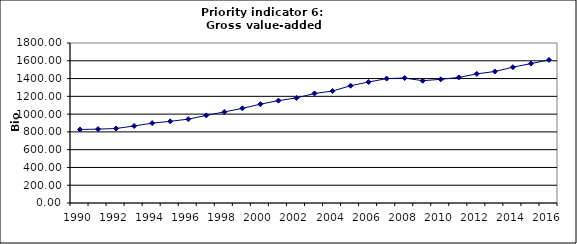
| Category | Gross value-added services, Bio Euro (EC95) |
|---|---|
| 1990 | 827.03 |
| 1991 | 831.245 |
| 1992 | 838.257 |
| 1993 | 866.571 |
| 1994 | 898.346 |
| 1995 | 918.561 |
| 1996 | 943.73 |
| 1997 | 985.48 |
| 1998 | 1024.267 |
| 1999 | 1064.871 |
| 2000 | 1111.666 |
| 2001 | 1151.879 |
| 2002 | 1182.259 |
| 2003 | 1232.364 |
| 2004 | 1259.6 |
| 2005 | 1319.116 |
| 2006 | 1361.304 |
| 2007 | 1399.526 |
| 2008 | 1406.056 |
| 2009 | 1375.467 |
| 2010 | 1391.566 |
| 2011 | 1412.611 |
| 2012 | 1452.492 |
| 2013 | 1479.487 |
| 2014 | 1528.099 |
| 2015 | 1568.387 |
| 2016 | 1609.256 |